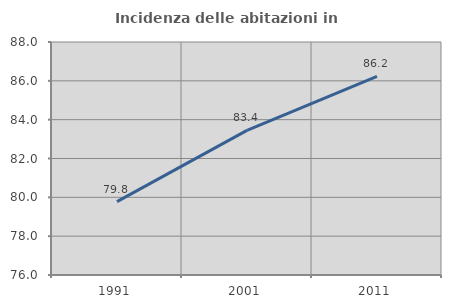
| Category | Incidenza delle abitazioni in proprietà  |
|---|---|
| 1991.0 | 79.779 |
| 2001.0 | 83.448 |
| 2011.0 | 86.228 |